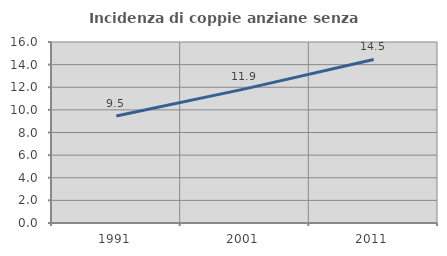
| Category | Incidenza di coppie anziane senza figli  |
|---|---|
| 1991.0 | 9.462 |
| 2001.0 | 11.854 |
| 2011.0 | 14.454 |